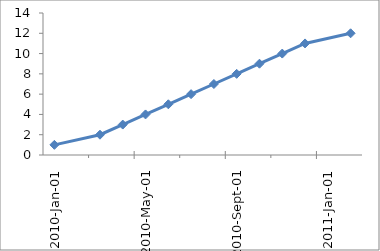
| Category | Series 1 |
|---|---|
| 2010-01-01 | 1 |
| 2010-03-01 | 2 |
| 2010-04-01 | 3 |
| 2010-05-01 | 4 |
| 2010-06-01 | 5 |
| 2010-07-01 | 6 |
| 2010-08-01 | 7 |
| 2010-09-01 | 8 |
| 2010-10-01 | 9 |
| 2010-11-01 | 10 |
| 2010-12-01 | 11 |
| 2011-02-01 | 12 |